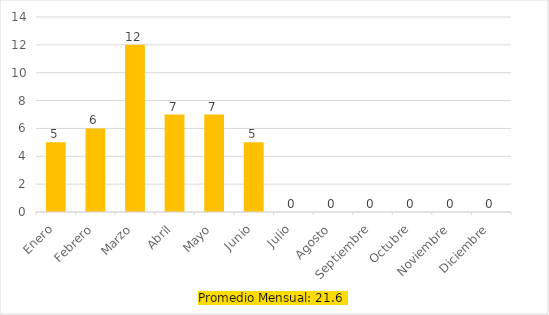
| Category | Series 0 |
|---|---|
| Enero | 5 |
| Febrero | 6 |
| Marzo | 12 |
| Abril | 7 |
| Mayo | 7 |
| Junio | 5 |
| Julio | 0 |
| Agosto | 0 |
| Septiembre | 0 |
| Octubre | 0 |
| Noviembre | 0 |
| Diciembre | 0 |